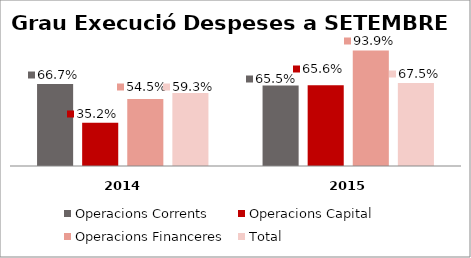
| Category | Operacions Corrents | Operacions Capital | Operacions Financeres | Total |
|---|---|---|---|---|
| 0 | 0.667 | 0.352 | 0.545 | 0.593 |
| 1 | 0.655 | 0.656 | 0.939 | 0.675 |